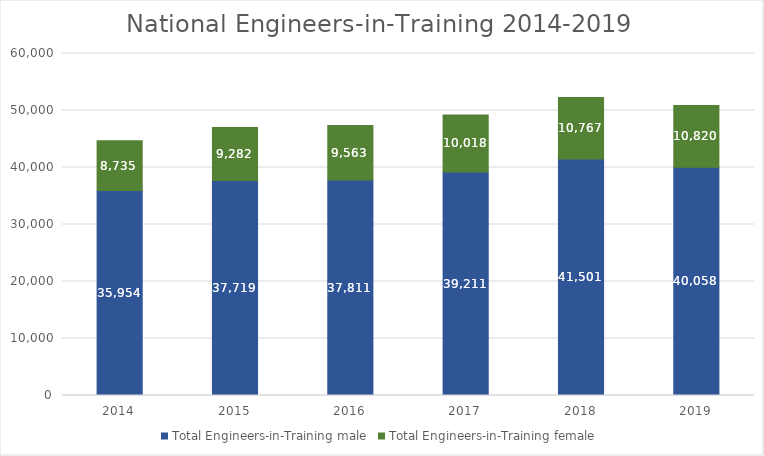
| Category | Total Engineers-in-Training male | Total Engineers-in-Training female |
|---|---|---|
| 2014.0 | 35954 | 8735 |
| 2015.0 | 37719 | 9282 |
| 2016.0 | 37811 | 9563 |
| 2017.0 | 39211 | 10018 |
| 2018.0 | 41501 | 10767 |
| 2019.0 | 40058 | 10820 |